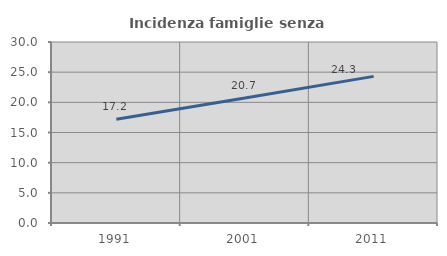
| Category | Incidenza famiglie senza nuclei |
|---|---|
| 1991.0 | 17.212 |
| 2001.0 | 20.722 |
| 2011.0 | 24.301 |